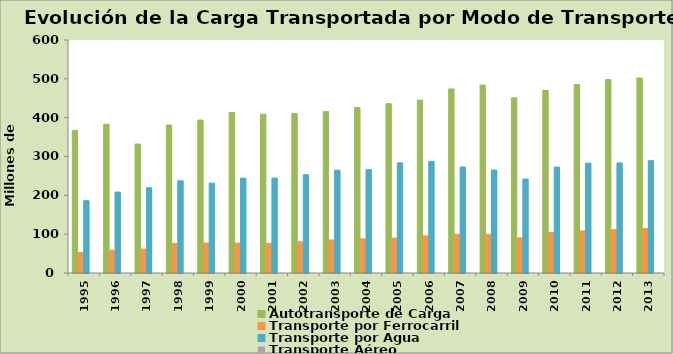
| Category | Autotransporte de Carga | Transporte por Ferrocarril | Transporte por Agua | Transporte Aéreo |
|---|---|---|---|---|
| 1995.0 | 367 | 53 | 186.2 | 0.252 |
| 1996.0 | 383 | 58.8 | 208.5 | 0.285 |
| 1997.0 | 332 | 61.6 | 219.6 | 0.335 |
| 1998.0 | 381 | 75.9 | 237.38 | 0.388 |
| 1999.0 | 394 | 77 | 231.44 | 0.407 |
| 2000.0 | 413 | 77.1 | 244.252 | 0.379 |
| 2001.0 | 409 | 76.1 | 244.431 | 0.351 |
| 2002.0 | 411 | 80.4 | 253.046 | 0.389 |
| 2003.0 | 416 | 85.1 | 264.739 | 0.41 |
| 2004.0 | 426 | 88 | 266.008 | 0.467 |
| 2005.0 | 436 | 89.8 | 283.604 | 0.529 |
| 2006.0 | 445 | 95.7 | 287.432 | 0.544 |
| 2007.0 | 474 | 99.8 | 272.934 | 0.572 |
| 2008.0 | 484 | 99.6 | 265.237 | 0.525 |
| 2009.0 | 451 | 90.3 | 241.923 | 0.466 |
| 2010.0 | 470 | 104.5 | 272.811 | 0.571 |
| 2011.0 | 485.502 | 108.4 | 282.902 | 0.56 |
| 2012.0 | 498.147 | 111.6 | 283.462 | 0.554 |
| 2013.0 | 502.15 | 114.4 | 289.131 | 0.55 |